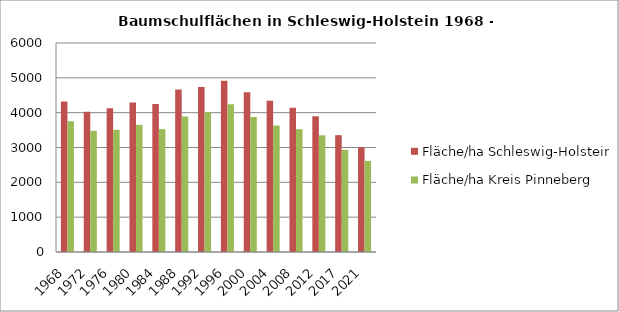
| Category | Fläche/ha Schleswig-Holstein | Fläche/ha Kreis Pinneberg |
|---|---|---|
| 1968.0 | 4324 | 3751 |
| 1972.0 | 4026 | 3478 |
| 1976.0 | 4126 | 3508 |
| 1980.0 | 4291 | 3650 |
| 1984.0 | 4251 | 3528 |
| 1988.0 | 4664 | 3893 |
| 1992.0 | 4734 | 4012 |
| 1996.0 | 4918 | 4239 |
| 2000.0 | 4587 | 3873 |
| 2004.0 | 4339 | 3629 |
| 2008.0 | 4143 | 3526 |
| 2012.0 | 3895 | 3349 |
| 2017.0 | 3354 | 2931 |
| 2021.0 | 3006 | 2617 |